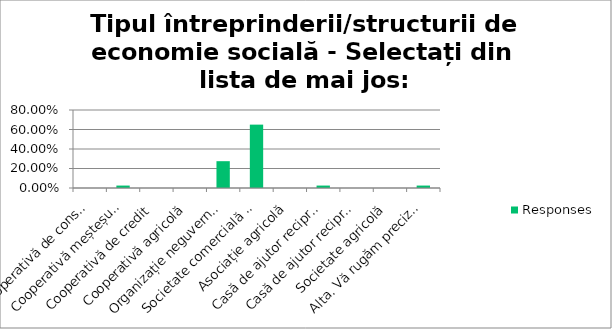
| Category | Responses |
|---|---|
| Cooperativă de consum | 0 |
| Cooperativă meșteșugărească | 0.025 |
| Cooperativă de credit | 0 |
| Cooperativă agricolă | 0 |
| Organizație neguvernamentală | 0.275 |
| Societate comercială (SRL, SA) | 0.65 |
| Asociație agricolă | 0 |
| Casă de ajutor reciproc a salariaților | 0.025 |
| Casă de ajutor reciproc a pensionarilor | 0 |
| Societate agricolă | 0 |
| Alta. Vă rugăm precizați | 0.025 |